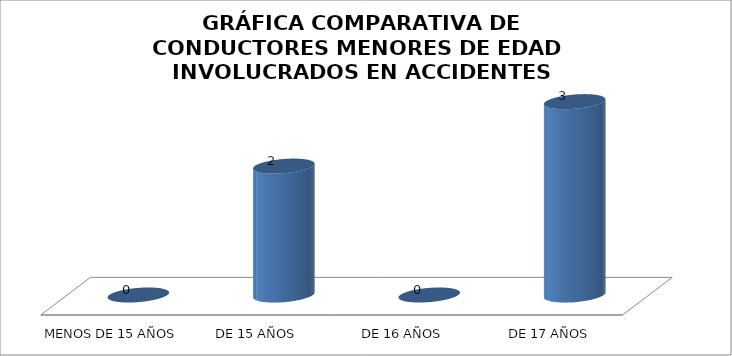
| Category | Series 0 |
|---|---|
| MENOS DE 15 AÑOS | 0 |
| DE 15 AÑOS | 2 |
| DE 16 AÑOS | 0 |
|  DE 17 AÑOS | 3 |